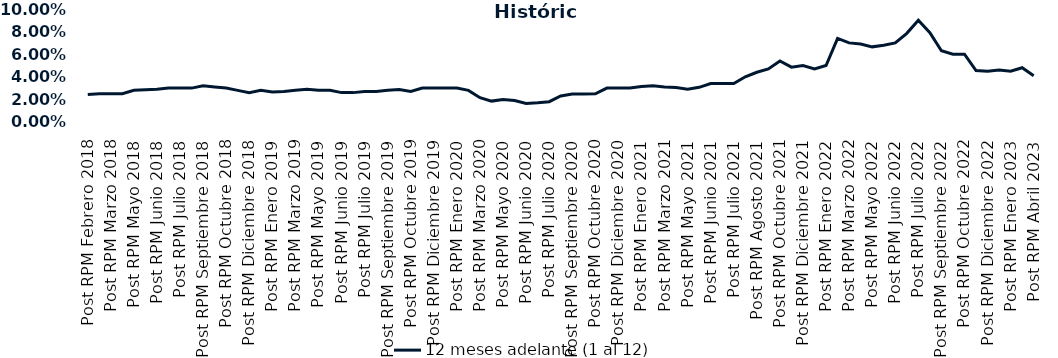
| Category | 12 meses adelante (1 al 12)  |
|---|---|
| Post RPM Febrero 2018 | 0.024 |
| Pre RPM Marzo 2018 | 0.025 |
| Post RPM Marzo 2018 | 0.025 |
| Pre RPM Mayo 2018 | 0.025 |
| Post RPM Mayo 2018 | 0.028 |
| Pre RPM Junio 2018 | 0.028 |
| Post RPM Junio 2018 | 0.029 |
| Pre RPM Julio 2018 | 0.03 |
| Post RPM Julio 2018 | 0.03 |
| Pre RPM Septiembre 2018 | 0.03 |
| Post RPM Septiembre 2018 | 0.032 |
| Pre RPM Octubre 2018 | 0.031 |
| Post RPM Octubre 2018 | 0.03 |
| Pre RPM Diciembre 2018 | 0.028 |
| Post RPM Diciembre 2018 | 0.026 |
| Pre RPM Enero 2019 | 0.028 |
| Post RPM Enero 2019 | 0.026 |
| Pre RPM Marzo 2019 | 0.027 |
| Post RPM Marzo 2019 | 0.028 |
| Pre RPM Mayo 2019 | 0.029 |
| Post RPM Mayo 2019 | 0.028 |
| Pre RPM Junio 2019 | 0.028 |
| Post RPM Junio 2019 | 0.026 |
| Pre RPM Julio 2019 | 0.026 |
| Post RPM Julio 2019 | 0.027 |
| Pre RPM Septiembre 2019 | 0.027 |
| Post RPM Septiembre 2019 | 0.028 |
| Pre RPM Octubre 2019 | 0.029 |
| Post RPM Octubre 2019 | 0.027 |
| Pre RPM Diciembre 2019 | 0.03 |
| Post RPM Diciembre 2019 | 0.03 |
| Pre RPM Enero 2020 | 0.03 |
| Post RPM Enero 2020 | 0.03 |
| Pre RPM Marzo 2020 | 0.028 |
| Post RPM Marzo 2020 | 0.022 |
| Pre RPM Mayo 2020 | 0.018 |
| Post RPM Mayo 2020 | 0.02 |
| Pre RPM Junio 2020 | 0.019 |
| Post RPM Junio 2020 | 0.016 |
| Pre RPM Julio 2020 | 0.017 |
| Post RPM Julio 2020 | 0.018 |
| Pre RPM Septiembre 2020 | 0.023 |
| Post RPM Septiembre 2020 | 0.025 |
| Pre RPM Octubre 2020 | 0.025 |
| Post RPM Octubre 2020 | 0.025 |
| Pre RPM Diciembre 2020 | 0.03 |
| Post RPM Diciembre 2020 | 0.03 |
| Pre RPM Enero 2021 | 0.03 |
| Post RPM Enero 2021 | 0.032 |
| Pre RPM Marzo 2021 | 0.032 |
| Post RPM Marzo 2021 | 0.031 |
| Pre RPM Mayo 2021 | 0.03 |
| Post RPM Mayo 2021 | 0.029 |
| Pre RPM Junio 2021 | 0.031 |
| Post RPM Junio 2021 | 0.034 |
| Pre RPM Julio 2021 | 0.034 |
| Post RPM Julio 2021 | 0.034 |
| Pre RPM Agosto 2021 | 0.04 |
| Post RPM Agosto 2021 | 0.044 |
| Pre RPM Octubre 2021 | 0.047 |
| Post RPM Octubre 2021 | 0.054 |
| Pre RPM Diciembre 2021 | 0.048 |
| Post RPM Diciembre 2021 | 0.05 |
| Pre RPM Enero 2022 | 0.047 |
| Post RPM Enero 2022 | 0.05 |
| Pre RPM Marzo 2022 | 0.074 |
| Post RPM Marzo 2022 | 0.07 |
| Pre RPM Mayo 2022 | 0.069 |
| Post RPM Mayo 2022 | 0.066 |
| Pre RPM Junio 2022 | 0.068 |
| Post RPM Junio 2022 | 0.07 |
| Pre RPM Julio 2022 | 0.078 |
| Post RPM Julio 2022 | 0.09 |
| Pre RPM Septiembre 2022 | 0.079 |
| Post RPM Septiembre 2022 | 0.063 |
| Pre RPM Octubre 2022 | 0.06 |
| Post RPM Octubre 2022 | 0.06 |
| Pre RPM Diciembre 2022 | 0.046 |
| Post RPM Diciembre 2022 | 0.045 |
| Pre RPM Enero 2023 | 0.046 |
| Post RPM Enero 2023 | 0.045 |
| Pre RPM Abril 2023 | 0.048 |
| Post RPM Abril 2023 | 0.041 |